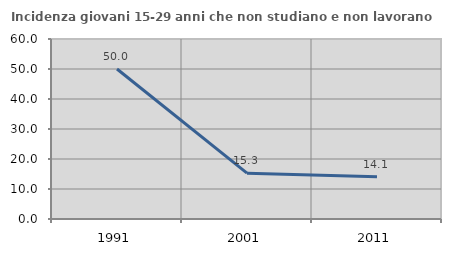
| Category | Incidenza giovani 15-29 anni che non studiano e non lavorano  |
|---|---|
| 1991.0 | 50 |
| 2001.0 | 15.267 |
| 2011.0 | 14.07 |